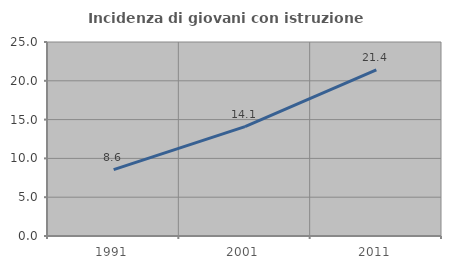
| Category | Incidenza di giovani con istruzione universitaria |
|---|---|
| 1991.0 | 8.558 |
| 2001.0 | 14.103 |
| 2011.0 | 21.409 |